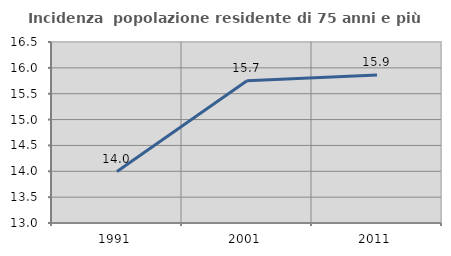
| Category | Incidenza  popolazione residente di 75 anni e più |
|---|---|
| 1991.0 | 13.994 |
| 2001.0 | 15.75 |
| 2011.0 | 15.86 |